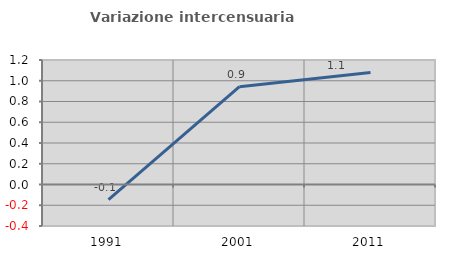
| Category | Variazione intercensuaria annua |
|---|---|
| 1991.0 | -0.145 |
| 2001.0 | 0.943 |
| 2011.0 | 1.079 |